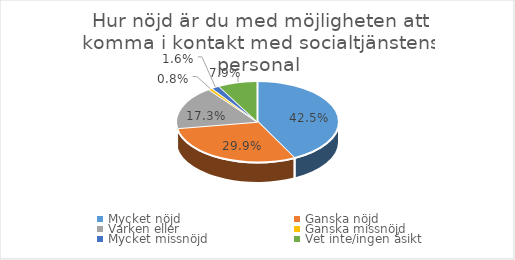
| Category | Series 0 |
|---|---|
| Mycket nöjd  | 0.425 |
| Ganska nöjd | 0.299 |
| Varken eller  | 0.173 |
| Ganska missnöjd | 0.008 |
| Mycket missnöjd  | 0.016 |
| Vet inte/ingen åsikt | 0.079 |